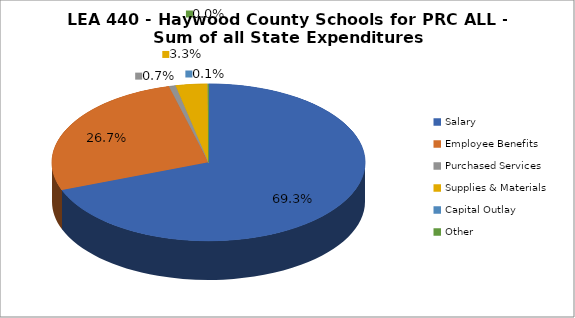
| Category | LEA 440 - Haywood County Schools for PRC ALL - Sum of all State Expenditures |
|---|---|
| Salary | 0.693 |
| Employee Benefits | 0.267 |
| Purchased Services | 0.007 |
| Supplies & Materials | 0.033 |
| Capital Outlay | 0.001 |
| Other | 0 |